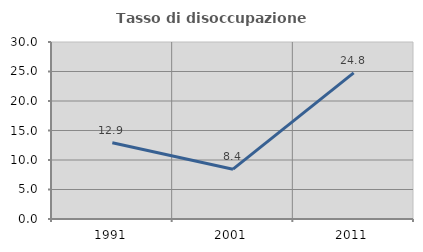
| Category | Tasso di disoccupazione giovanile  |
|---|---|
| 1991.0 | 12.929 |
| 2001.0 | 8.442 |
| 2011.0 | 24.762 |